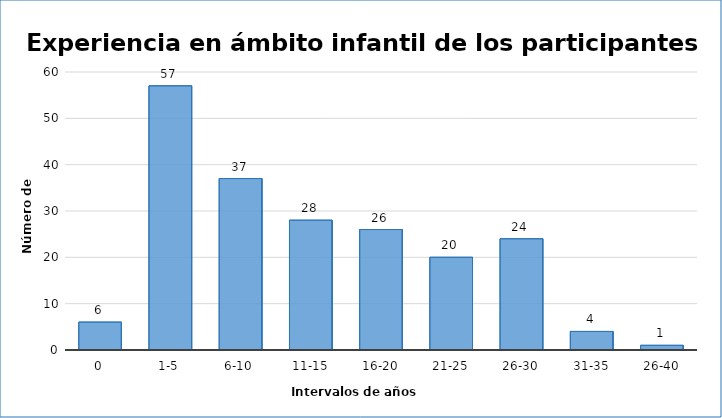
| Category | Series 0 |
|---|---|
| 0 | 6 |
| 1-5 | 57 |
| 6-10 | 37 |
| 11-15 | 28 |
| 16-20 | 26 |
| 21-25 | 20 |
| 26-30 | 24 |
| 31-35 | 4 |
| 26-40 | 1 |